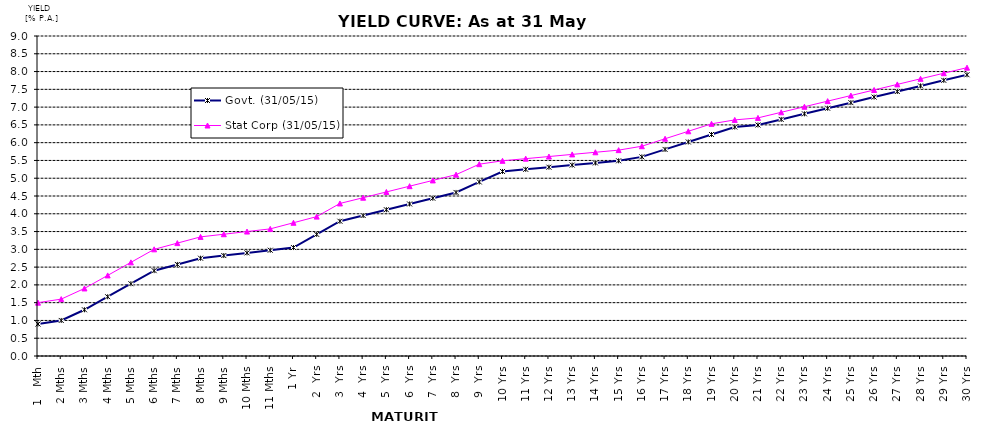
| Category | Govt. (31/05/15) | Stat Corp (31/05/15) | Difference |
|---|---|---|---|
| 1   Mth | 0.9 | 1.5 |  |
| 2 Mths | 1 | 1.6 |  |
| 3 Mths | 1.3 | 1.9 |  |
| 4 Mths | 1.667 | 2.267 |  |
| 5 Mths | 2.033 | 2.633 |  |
| 6 Mths | 2.4 | 3 |  |
| 7 Mths | 2.575 | 3.175 |  |
| 8 Mths | 2.75 | 3.35 |  |
| 9 Mths | 2.825 | 3.425 |  |
| 10 Mths | 2.9 | 3.5 |  |
| 11 Mths | 2.975 | 3.575 |  |
| 1 Yr | 3.05 | 3.748 |  |
| 2  Yrs | 3.42 | 3.92 |  |
| 3  Yrs | 3.79 | 4.29 |  |
| 4  Yrs | 3.952 | 4.452 |  |
| 5  Yrs | 4.114 | 4.614 |  |
| 6  Yrs | 4.276 | 4.776 |  |
| 7  Yrs | 4.438 | 4.938 |  |
| 8  Yrs | 4.6 | 5.1 |  |
| 9  Yrs | 4.895 | 5.395 |  |
| 10 Yrs | 5.19 | 5.49 |  |
| 11 Yrs | 5.25 | 5.55 |  |
| 12 Yrs | 5.31 | 5.61 |  |
| 13 Yrs | 5.37 | 5.67 |  |
| 14 Yrs | 5.43 | 5.73 |  |
| 15 Yrs | 5.49 | 5.79 |  |
| 16 Yrs | 5.6 | 5.9 |  |
| 17 Yrs | 5.81 | 6.11 |  |
| 18 Yrs | 6.02 | 6.32 |  |
| 19 Yrs | 6.23 | 6.53 |  |
| 20 Yrs | 6.44 | 6.64 |  |
| 21 Yrs | 6.497 | 6.697 |  |
| 22 Yrs | 6.654 | 6.854 |  |
| 23 Yrs | 6.811 | 7.011 |  |
| 24 Yrs | 6.968 | 7.168 |  |
| 25 Yrs | 7.125 | 7.325 |  |
| 26 Yrs | 7.282 | 7.482 |  |
| 27 Yrs | 7.439 | 7.639 |  |
| 28 Yrs | 7.596 | 7.796 |  |
| 29 Yrs | 7.753 | 7.953 |  |
| 30 Yrs | 7.91 | 8.11 |  |